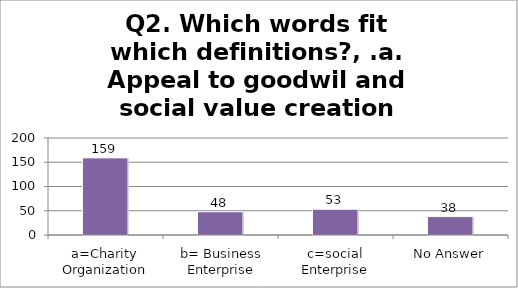
| Category | Q2. Which words fit which definitions?, .a. Appeal to goodwil and social value creation |
|---|---|
| a=Charity Organization | 159 |
| b= Business Enterprise | 48 |
| c=social Enterprise | 53 |
| No Answer | 38 |